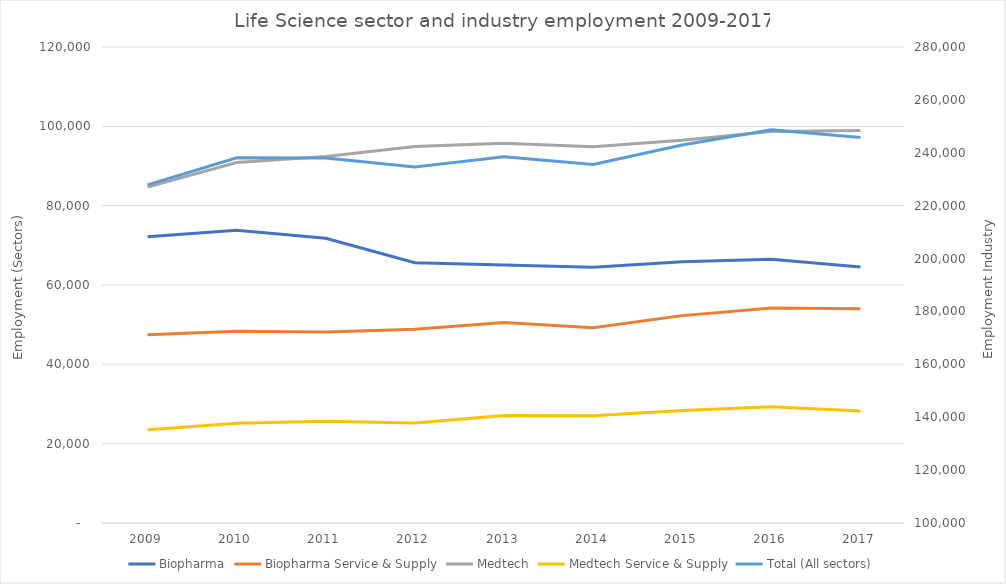
| Category | Biopharma | Biopharma Service & Supply | Medtech | Medtech Service & Supply |
|---|---|---|---|---|
| 2009 | 72154 | 47467 | 84717 | 23517 |
| 2010 | 73812 | 48313 | 90878 | 25117 |
| 2011 | 71795 | 48150 | 92408 | 25634 |
| 2012 | 65627 | 48873 | 94932 | 25180 |
| 2013 | 65057 | 50556 | 95763 | 27074 |
| 2014 | 64455 | 49229 | 94873 | 27055 |
| 2015 | 65849 | 52280 | 96463 | 28371 |
| 2016 | 66472 | 54190 | 98695 | 29308 |
| 2017 | 64539 | 54029 | 98956 | 28246 |